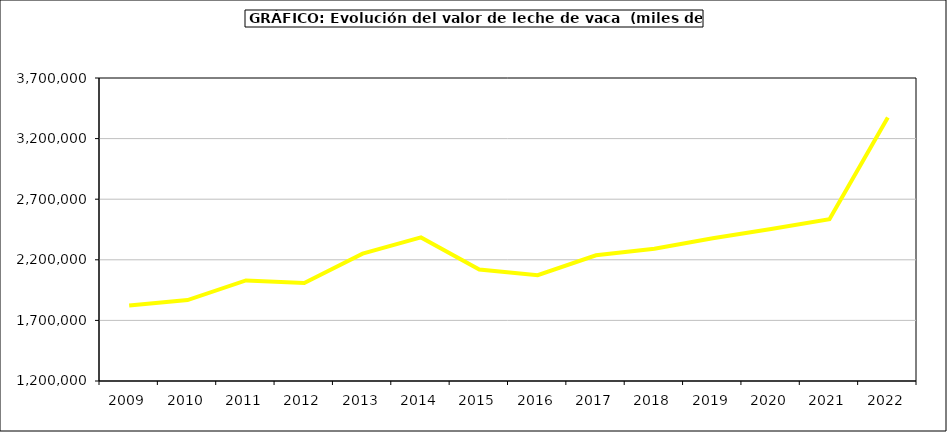
| Category | Leche de vaca |
|---|---|
| 2009.0 | 1822023.094 |
| 2010.0 | 1867616.94 |
| 2011.0 | 2029996.881 |
| 2012.0 | 2008801.055 |
| 2013.0 | 2250497.404 |
| 2014.0 | 2384761.493 |
| 2015.0 | 2119762.267 |
| 2016.0 | 2072491.339 |
| 2017.0 | 2237588.977 |
| 2018.0 | 2291136.14 |
| 2019.0 | 2377548.95 |
| 2020.0 | 2454618.621 |
| 2021.0 | 2535478.322 |
| 2022.0 | 3375002.83 |